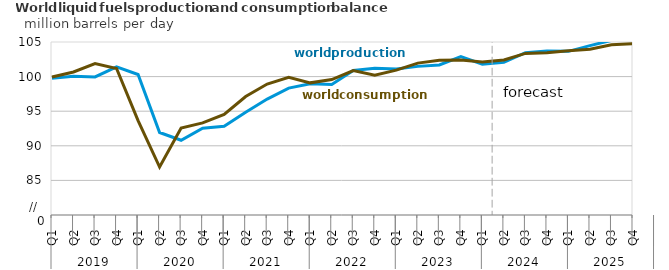
| Category | World production | World consumption |
|---|---|---|
| 0 | 99.755 | 99.941 |
| 1900-01-01 | 100.056 | 100.666 |
| 1900-01-02 | 99.953 | 101.872 |
| 1900-01-03 | 101.415 | 101.169 |
| 1900-01-04 | 100.302 | 93.642 |
| 1900-01-05 | 91.918 | 86.929 |
| 1900-01-06 | 90.802 | 92.563 |
| 1900-01-07 | 92.542 | 93.305 |
| 1900-01-08 | 92.814 | 94.521 |
| 1900-01-09 | 94.837 | 97.124 |
| 1900-01-10 | 96.755 | 98.921 |
| 1900-01-11 | 98.34 | 99.906 |
| 1900-01-12 | 98.964 | 99.097 |
| 1900-01-13 | 98.864 | 99.568 |
| 1900-01-14 | 100.885 | 100.87 |
| 1900-01-15 | 101.196 | 100.206 |
| 1900-01-16 | 101.106 | 100.93 |
| 1900-01-17 | 101.478 | 101.951 |
| 1900-01-18 | 101.689 | 102.373 |
| 1900-01-19 | 102.881 | 102.393 |
| 1900-01-20 | 101.793 | 102.112 |
| 1900-01-21 | 102.053 | 102.405 |
| 1900-01-22 | 103.461 | 103.354 |
| 1900-01-23 | 103.709 | 103.456 |
| 1900-01-24 | 103.65 | 103.721 |
| 1900-01-25 | 104.482 | 103.945 |
| 1900-01-26 | 105.229 | 104.615 |
| 1900-01-27 | 105.234 | 104.746 |